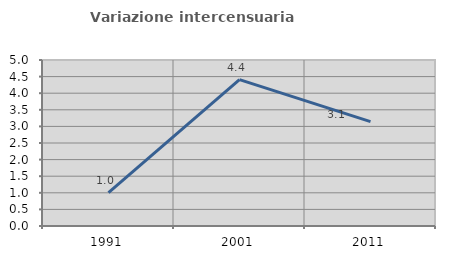
| Category | Variazione intercensuaria annua |
|---|---|
| 1991.0 | 1.008 |
| 2001.0 | 4.407 |
| 2011.0 | 3.142 |